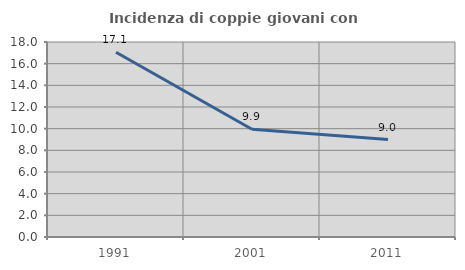
| Category | Incidenza di coppie giovani con figli |
|---|---|
| 1991.0 | 17.054 |
| 2001.0 | 9.94 |
| 2011.0 | 8.997 |